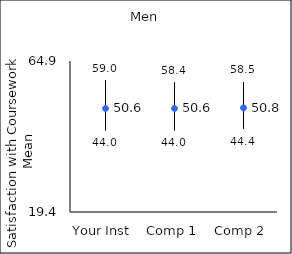
| Category | 25th percentile | 75th percentile | Mean |
|---|---|---|---|
| Your Inst | 44 | 59 | 50.59 |
| Comp 1 | 44 | 58.4 | 50.61 |
| Comp 2 | 44.4 | 58.5 | 50.78 |